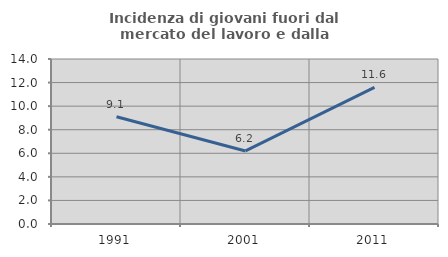
| Category | Incidenza di giovani fuori dal mercato del lavoro e dalla formazione  |
|---|---|
| 1991.0 | 9.106 |
| 2001.0 | 6.197 |
| 2011.0 | 11.588 |